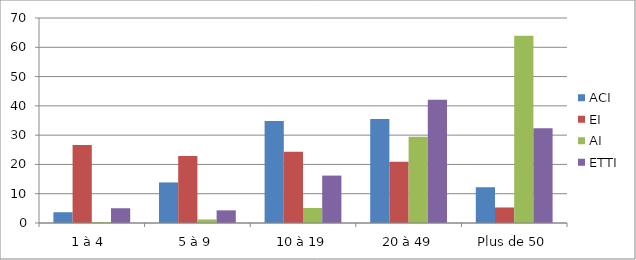
| Category | ACI | EI | AI | ETTI |
|---|---|---|---|---|
| 1 à 4  | 3.68 | 26.61 | 0.3 | 5.04 |
| 5 à 9 | 13.85 | 22.87 | 1.21 | 4.32 |
| 10 à 19 | 34.79 | 24.32 | 5.13 | 16.19 |
| 20 à 49 | 35.47 | 20.9 | 29.41 | 42.09 |
| Plus de 50 | 12.21 | 5.3 | 63.95 | 32.37 |